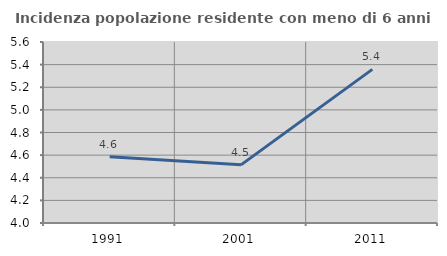
| Category | Incidenza popolazione residente con meno di 6 anni |
|---|---|
| 1991.0 | 4.585 |
| 2001.0 | 4.514 |
| 2011.0 | 5.358 |